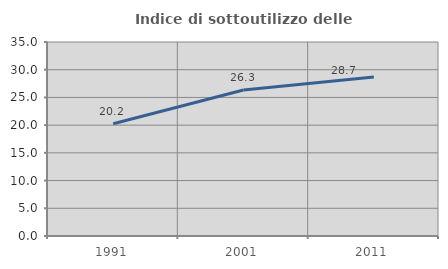
| Category | Indice di sottoutilizzo delle abitazioni  |
|---|---|
| 1991.0 | 20.238 |
| 2001.0 | 26.331 |
| 2011.0 | 28.674 |